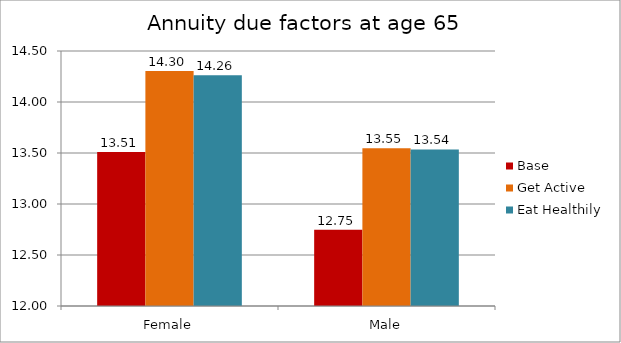
| Category | Base | Get Active | Eat Healthily |
|---|---|---|---|
| Female | 13.509 | 14.303 | 14.263 |
| Male | 12.748 | 13.547 | 13.535 |